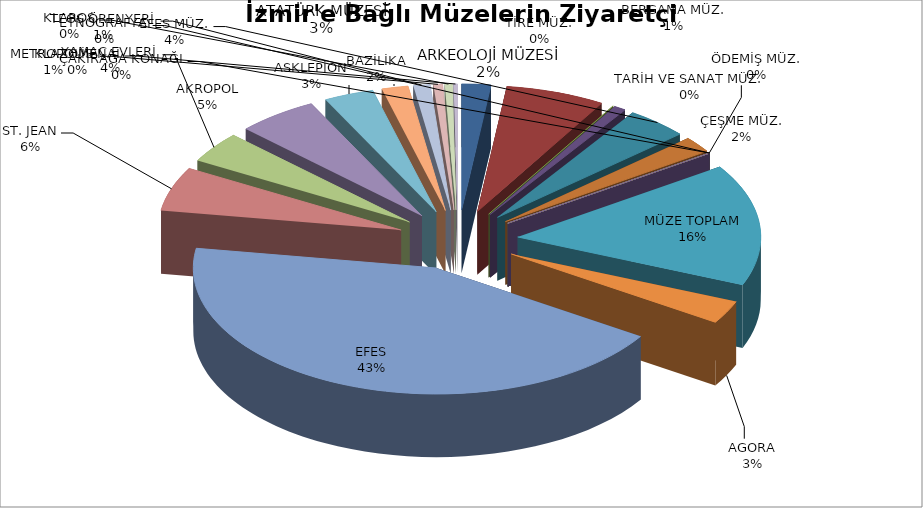
| Category | Series 0 |
|---|---|
| ARKEOLOJİ MÜZESİ | 17638 |
| ATATÜRK MÜZESİ | 60208 |
| TARİH VE SANAT MÜZ. | 227 |
| BERGAMA MÜZ. | 7393 |
| EFES MÜZ. | 37691 |
| ÇEŞME MÜZ. | 18599 |
| ÖDEMİŞ MÜZ. | 456 |
| TİRE MÜZ. | 0 |
| ÇAKIRAĞA KONAĞI | 0 |
| ETNOGRAFYA | 0 |
| MÜZE TOPLAM | 142212 |
| AGORA | 26836 |
| EFES | 395598 |
| ST. JEAN | 51405 |
| YAMAÇ EVLERİ | 36159 |
| AKROPOL | 48997 |
| ASKLEPİON | 30216 |
| BAZİLİKA | 15975 |
| TEOS ÖRENYERİ | 10077 |
| METROPOLİS | 5587 |
| KLAROS | 4449 |
| KLAZOMENAİ | 2306 |